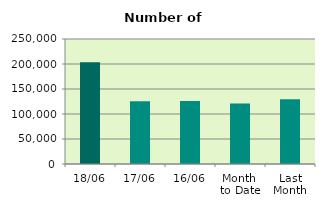
| Category | Series 0 |
|---|---|
| 18/06 | 203500 |
| 17/06 | 125398 |
| 16/06 | 126078 |
| Month 
to Date | 121234.143 |
| Last
Month | 129378.19 |